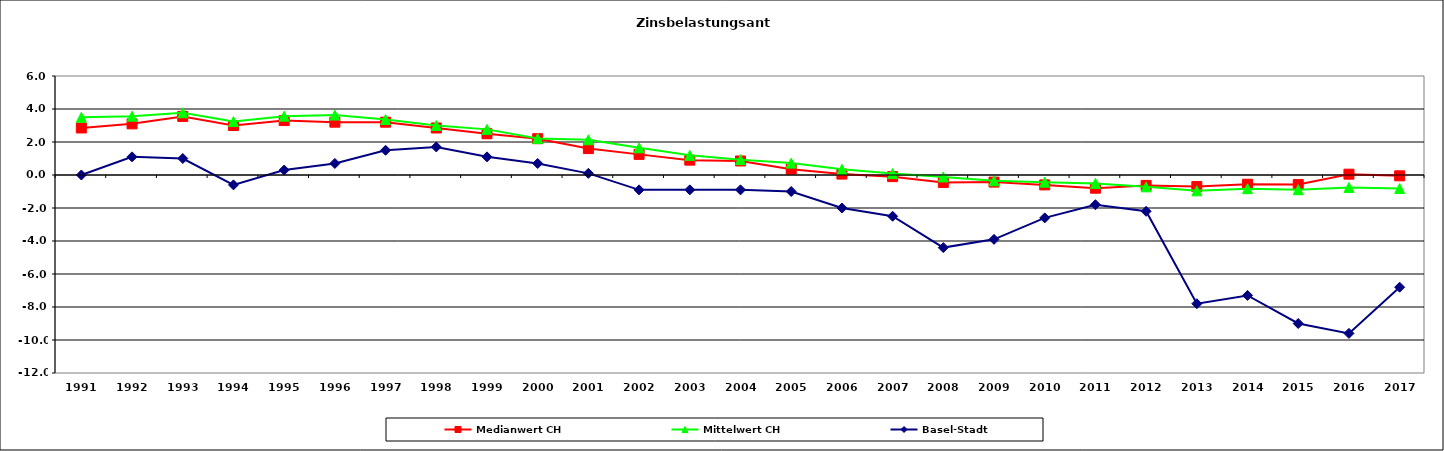
| Category | Medianwert CH | Mittelwert CH | Basel-Stadt |
|---|---|---|---|
| 1991.0 | 2.85 | 3.5 | 0 |
| 1992.0 | 3.1 | 3.565 | 1.1 |
| 1993.0 | 3.55 | 3.772 | 1 |
| 1994.0 | 3 | 3.238 | -0.6 |
| 1995.0 | 3.3 | 3.565 | 0.3 |
| 1996.0 | 3.2 | 3.632 | 0.7 |
| 1997.0 | 3.2 | 3.361 | 1.5 |
| 1998.0 | 2.85 | 3 | 1.7 |
| 1999.0 | 2.5 | 2.765 | 1.1 |
| 2000.0 | 2.2 | 2.216 | 0.7 |
| 2001.0 | 1.6 | 2.135 | 0.1 |
| 2002.0 | 1.25 | 1.646 | -0.9 |
| 2003.0 | 0.9 | 1.191 | -0.9 |
| 2004.0 | 0.85 | 0.93 | -0.9 |
| 2005.0 | 0.355 | 0.72 | -1 |
| 2006.0 | 0.055 | 0.346 | -2 |
| 2007.0 | -0.1 | 0.087 | -2.5 |
| 2008.0 | -0.45 | -0.117 | -4.4 |
| 2009.0 | -0.43 | -0.354 | -3.9 |
| 2010.0 | -0.6 | -0.433 | -2.6 |
| 2011.0 | -0.8 | -0.508 | -1.8 |
| 2012.0 | -0.63 | -0.718 | -2.2 |
| 2013.0 | -0.7 | -0.96 | -7.8 |
| 2014.0 | -0.56 | -0.829 | -7.3 |
| 2015.0 | -0.58 | -0.892 | -9 |
| 2016.0 | 0.05 | -0.754 | -9.6 |
| 2017.0 | -0.05 | -0.819 | -6.8 |